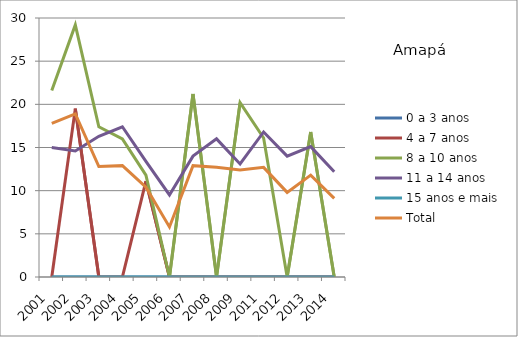
| Category | 0 a 3 anos | 4 a 7 anos | 8 a 10 anos | 11 a 14 anos | 15 anos e mais | Total |
|---|---|---|---|---|---|---|
| 2001.0 | 0 | 0 | 21.6 | 15 | 0 | 17.8 |
| 2002.0 | 0 | 19.5 | 29.2 | 14.6 | 0 | 18.9 |
| 2003.0 | 0 | 0 | 17.4 | 16.3 | 0 | 12.8 |
| 2004.0 | 0 | 0 | 16 | 17.4 | 0 | 12.9 |
| 2005.0 | 0 | 11.1 | 11.8 | 13.4 | 0 | 10.4 |
| 2006.0 | 0 | 0 | 0 | 9.5 | 0 | 5.8 |
| 2007.0 | 0 | 0 | 21.2 | 14 | 0 | 12.9 |
| 2008.0 | 0 | 0 | 0 | 16 | 0 | 12.7 |
| 2009.0 | 0 | 0 | 20.2 | 13.1 | 0 | 12.4 |
| 2011.0 | 0 | 0 | 16.1 | 16.8 | 0 | 12.7 |
| 2012.0 | 0 | 0 | 0 | 14 | 0 | 9.8 |
| 2013.0 | 0 | 0 | 16.8 | 15.1 | 0 | 11.8 |
| 2014.0 | 0 | 0 | 0 | 12.2 | 0 | 9.1 |